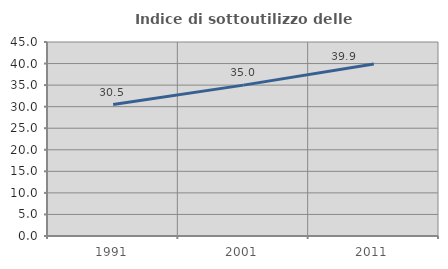
| Category | Indice di sottoutilizzo delle abitazioni  |
|---|---|
| 1991.0 | 30.479 |
| 2001.0 | 35 |
| 2011.0 | 39.915 |